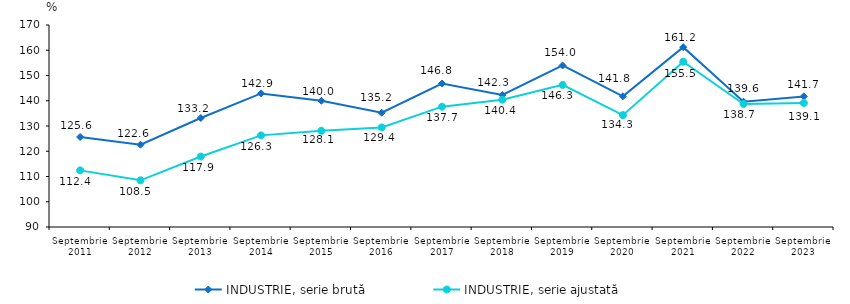
| Category | INDUSTRIE, serie brută | INDUSTRIE, serie ajustată |
|---|---|---|
| Septembrie
2011 | 125.646 | 112.426 |
| Septembrie
2012 | 122.596 | 108.484 |
| Septembrie
2013 | 133.162 | 117.901 |
| Septembrie
2014 | 142.903 | 126.288 |
| Septembrie
2015 | 139.986 | 128.11 |
| Septembrie
2016 | 135.249 | 129.432 |
| Septembrie
2017 | 146.829 | 137.657 |
| Septembrie
2018 | 142.277 | 140.43 |
| Septembrie
2019 | 153.971 | 146.278 |
| Septembrie
2020 | 141.768 | 134.304 |
| Septembrie
2021 | 161.222 | 155.46 |
| Septembrie
2022 | 139.624 | 138.713 |
| Septembrie
2023 | 141.73 | 139.126 |